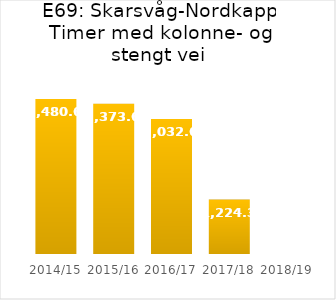
| Category | TOTTID |
|---|---|
| 2014/15 | 3480.6 |
| 2015/16 | 3373.6 |
| 2016/17 | 3032.6 |
| 2017/18 | 1224.3 |
| 2018/19 | 0 |